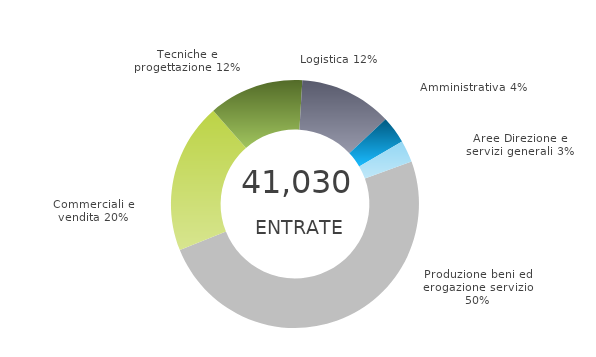
| Category | Series 0 | Series 1 |
|---|---|---|
| Produzione beni ed erogazione servizio | 0 | 0.495 |
| Commerciali e vendita | 0 | 0.196 |
| Tecniche e progettazione | 0 | 0.124 |
| Logistica | 0 | 0.121 |
| Amministrativa | 0 | 0.035 |
| Aree Direzione e servizi generali | 0 | 0.029 |